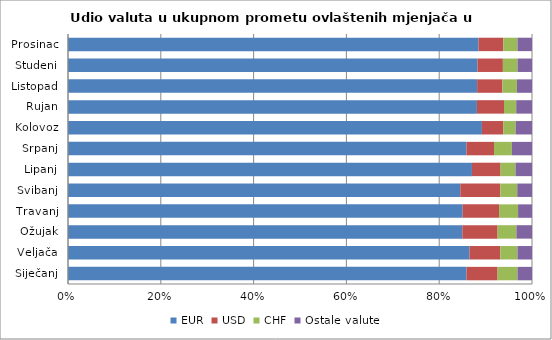
| Category | EUR | USD | CHF | Ostale valute |
|---|---|---|---|---|
| Siječanj | 85.873 | 6.711 | 4.286 | 3.13 |
| Veljača | 86.522 | 6.646 | 3.702 | 3.13 |
| Ožujak | 84.983 | 7.607 | 4.05 | 3.36 |
| Travanj | 85.056 | 7.851 | 4.091 | 3.003 |
| Svibanj | 84.548 | 8.632 | 3.639 | 3.181 |
| Lipanj | 87.059 | 6.174 | 3.21 | 3.557 |
| Srpanj | 85.867 | 5.939 | 3.86 | 4.335 |
| Kolovoz | 89.206 | 4.626 | 2.64 | 3.528 |
| Rujan | 88.125 | 5.838 | 2.632 | 3.405 |
| Listopad | 88.175 | 5.449 | 3.123 | 3.254 |
| Studeni | 88.261 | 5.464 | 3.152 | 3.124 |
| Prosinac | 88.476 | 5.35 | 3.045 | 3.129 |